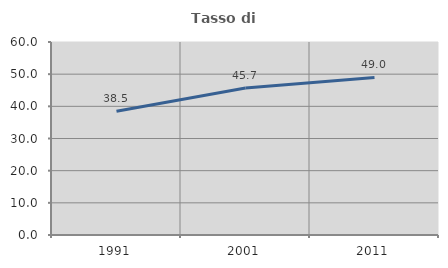
| Category | Tasso di occupazione   |
|---|---|
| 1991.0 | 38.467 |
| 2001.0 | 45.694 |
| 2011.0 | 48.984 |